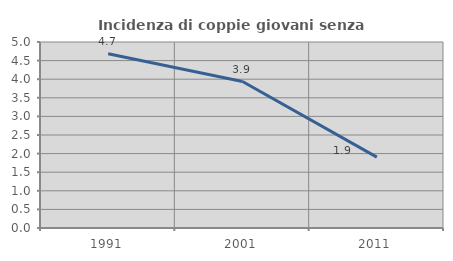
| Category | Incidenza di coppie giovani senza figli |
|---|---|
| 1991.0 | 4.686 |
| 2001.0 | 3.938 |
| 2011.0 | 1.907 |